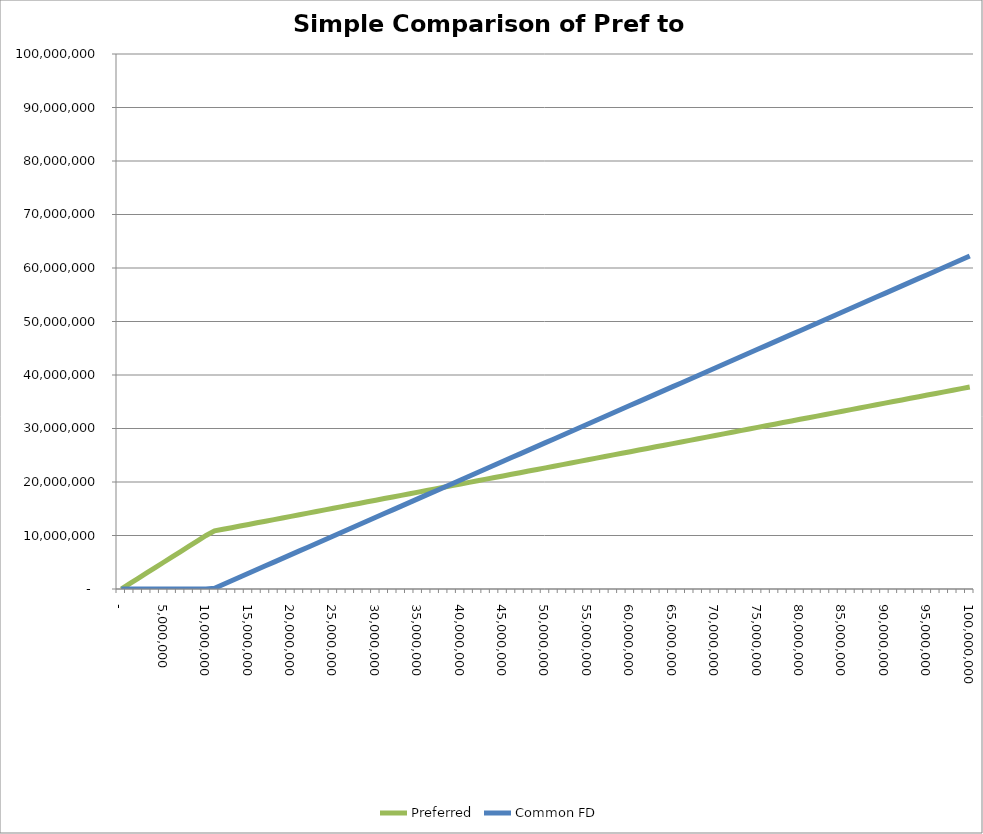
| Category | Preferred | Common FD |
|---|---|---|
| 0.0 | 0 | 0 |
| 1000000.0 | 1000000 | 0 |
| 2000000.0 | 2000000 | 0 |
| 3000000.0 | 3000000 | 0 |
| 4000000.0 | 4000000 | 0 |
| 5000000.0 | 5000000 | 0 |
| 6000000.0 | 6000000 | 0 |
| 7000000.0 | 7000000 | 0 |
| 8000000.0 | 8000000 | 0 |
| 9000000.0 | 9000000 | 0 |
| 10000000.0 | 10000000 | 0 |
| 11000000.0 | 10856705.554 | 143294.446 |
| 12000000.0 | 11158984.62 | 841015.38 |
| 13000000.0 | 11461263.686 | 1538736.314 |
| 14000000.0 | 11763542.752 | 2236457.248 |
| 15000000.0 | 12065821.818 | 2934178.182 |
| 16000000.0 | 12368100.883 | 3631899.117 |
| 17000000.0 | 12670379.949 | 4329620.051 |
| 18000000.0 | 12972659.015 | 5027340.985 |
| 19000000.0 | 13274938.081 | 5725061.919 |
| 20000000.0 | 13577217.147 | 6422782.853 |
| 21000000.0 | 13879496.213 | 7120503.787 |
| 22000000.0 | 14181775.279 | 7818224.721 |
| 23000000.0 | 14484054.345 | 8515945.655 |
| 24000000.0 | 14786333.411 | 9213666.589 |
| 25000000.0 | 15088612.477 | 9911387.523 |
| 26000000.0 | 15390891.543 | 10609108.457 |
| 27000000.0 | 15693170.609 | 11306829.391 |
| 28000000.0 | 15995449.675 | 12004550.325 |
| 29000000.0 | 16297728.741 | 12702271.259 |
| 30000000.0 | 16600007.807 | 13399992.193 |
| 31000000.0 | 16902286.873 | 14097713.127 |
| 32000000.0 | 17204565.939 | 14795434.061 |
| 33000000.0 | 17506845.005 | 15493154.995 |
| 34000000.0 | 17809124.071 | 16190875.929 |
| 35000000.0 | 18111403.137 | 16888596.863 |
| 36000000.0 | 18413682.203 | 17586317.797 |
| 37000000.0 | 18715961.269 | 18284038.731 |
| 38000000.0 | 19018240.335 | 18981759.665 |
| 39000000.0 | 19320519.401 | 19679480.599 |
| 40000000.0 | 19622798.467 | 20377201.533 |
| 41000000.0 | 19925077.533 | 21074922.467 |
| 42000000.0 | 20227356.599 | 21772643.401 |
| 43000000.0 | 20529635.665 | 22470364.335 |
| 44000000.0 | 20831914.731 | 23168085.269 |
| 45000000.0 | 21134193.796 | 23865806.204 |
| 46000000.0 | 21436472.862 | 24563527.138 |
| 47000000.0 | 21738751.928 | 25261248.072 |
| 48000000.0 | 22041030.994 | 25958969.006 |
| 49000000.0 | 22343310.06 | 26656689.94 |
| 50000000.0 | 22645589.126 | 27354410.874 |
| 51000000.0 | 22947868.192 | 28052131.808 |
| 52000000.0 | 23250147.258 | 28749852.742 |
| 53000000.0 | 23552426.324 | 29447573.676 |
| 54000000.0 | 23854705.39 | 30145294.61 |
| 55000000.0 | 24156984.456 | 30843015.544 |
| 56000000.0 | 24459263.522 | 31540736.478 |
| 57000000.0 | 24761542.588 | 32238457.412 |
| 58000000.0 | 25063821.654 | 32936178.346 |
| 59000000.0 | 25366100.72 | 33633899.28 |
| 60000000.0 | 25668379.786 | 34331620.214 |
| 61000000.0 | 25970658.852 | 35029341.148 |
| 62000000.0 | 26272937.918 | 35727062.082 |
| 63000000.0 | 26575216.984 | 36424783.016 |
| 64000000.0 | 26877496.05 | 37122503.95 |
| 65000000.0 | 27179775.116 | 37820224.884 |
| 66000000.0 | 27482054.182 | 38517945.818 |
| 67000000.0 | 27784333.248 | 39215666.752 |
| 68000000.0 | 28086612.314 | 39913387.686 |
| 69000000.0 | 28388891.38 | 40611108.62 |
| 70000000.0 | 28691170.446 | 41308829.554 |
| 71000000.0 | 28993449.512 | 42006550.488 |
| 72000000.0 | 29295728.578 | 42704271.422 |
| 73000000.0 | 29598007.644 | 43401992.356 |
| 74000000.0 | 29900286.709 | 44099713.291 |
| 75000000.0 | 30202565.775 | 44797434.225 |
| 76000000.0 | 30504844.841 | 45495155.159 |
| 77000000.0 | 30807123.907 | 46192876.093 |
| 78000000.0 | 31109402.973 | 46890597.027 |
| 79000000.0 | 31411682.039 | 47588317.961 |
| 80000000.0 | 31713961.105 | 48286038.895 |
| 81000000.0 | 32016240.171 | 48983759.829 |
| 82000000.0 | 32318519.237 | 49681480.763 |
| 83000000.0 | 32620798.303 | 50379201.697 |
| 84000000.0 | 32923077.369 | 51076922.631 |
| 85000000.0 | 33225356.435 | 51774643.565 |
| 86000000.0 | 33527635.501 | 52472364.499 |
| 87000000.0 | 33829914.567 | 53170085.433 |
| 88000000.0 | 34132193.633 | 53867806.367 |
| 89000000.0 | 34434472.699 | 54565527.301 |
| 90000000.0 | 34736751.765 | 55263248.235 |
| 91000000.0 | 35039030.831 | 55960969.169 |
| 92000000.0 | 35341309.897 | 56658690.103 |
| 93000000.0 | 35643588.963 | 57356411.037 |
| 94000000.0 | 35945868.029 | 58054131.971 |
| 95000000.0 | 36248147.095 | 58751852.905 |
| 96000000.0 | 36550426.161 | 59449573.839 |
| 97000000.0 | 36852705.227 | 60147294.773 |
| 98000000.0 | 37154984.293 | 60845015.707 |
| 99000000.0 | 37457263.359 | 61542736.641 |
| 100000000.0 | 37759542.425 | 62240457.575 |